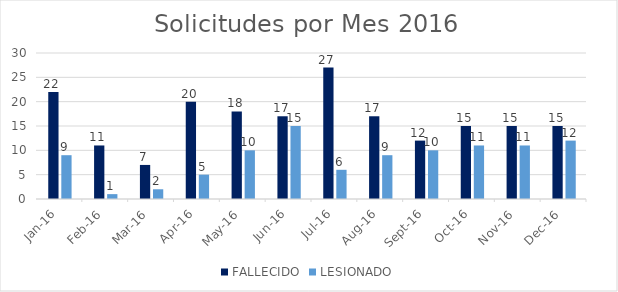
| Category | FALLECIDO | LESIONADO |
|---|---|---|
| 2016-01-01 | 22 | 9 |
| 2016-02-01 | 11 | 1 |
| 2016-03-01 | 7 | 2 |
| 2016-04-01 | 20 | 5 |
| 2016-05-01 | 18 | 10 |
| 2016-06-01 | 17 | 15 |
| 2016-07-01 | 27 | 6 |
| 2016-08-01 | 17 | 9 |
| 2016-09-01 | 12 | 10 |
| 2016-10-01 | 15 | 11 |
| 2016-11-01 | 15 | 11 |
| 2016-12-01 | 15 | 12 |